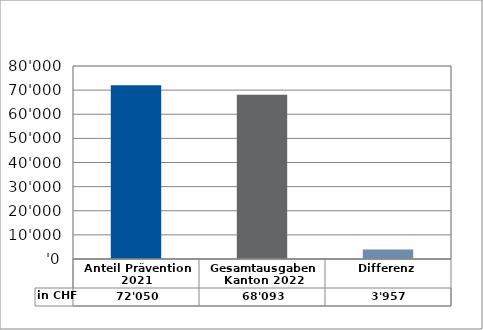
| Category | in CHF |
|---|---|
| Anteil Prävention 2021

 | 72050 |
| Gesamtausgaben Kanton 2022
 | 68093 |
| Differenz | 3957 |